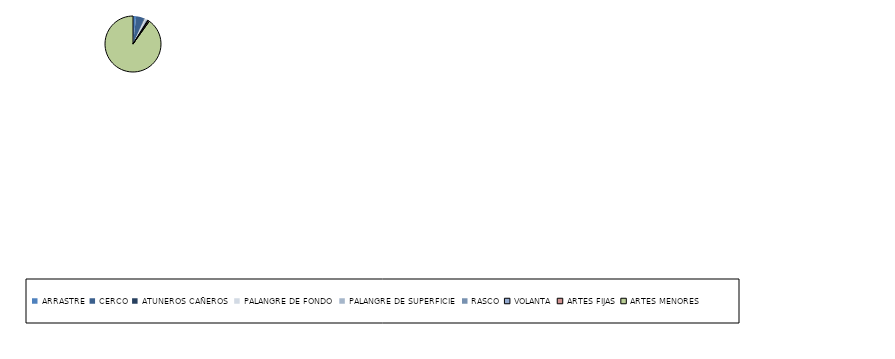
| Category | Series 0 |
|---|---|
| ARRASTRE | 5 |
| CERCO | 13 |
| ATUNEROS CAÑEROS | 1 |
| PALANGRE DE FONDO | 2 |
| PALANGRE DE SUPERFICIE | 2 |
| RASCO | 1 |
| VOLANTA | 1 |
| ARTES FIJAS | 2 |
| ARTES MENORES | 246 |